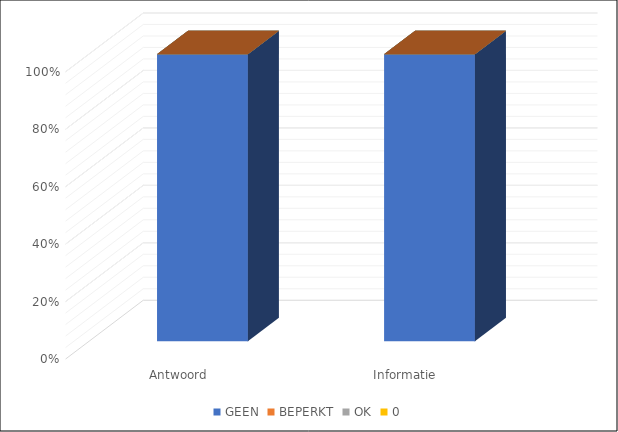
| Category | GEEN | BEPERKT | OK | 0 |
|---|---|---|---|---|
| Antwoord | 68 | 0 | 0 | 0 |
| Informatie | 68 | 0 | 0 | 0 |